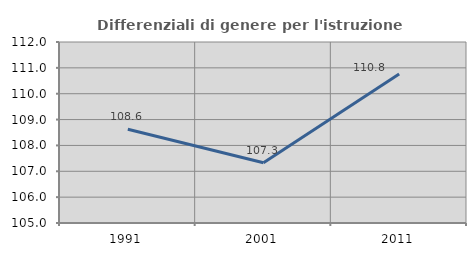
| Category | Differenziali di genere per l'istruzione superiore |
|---|---|
| 1991.0 | 108.623 |
| 2001.0 | 107.331 |
| 2011.0 | 110.759 |